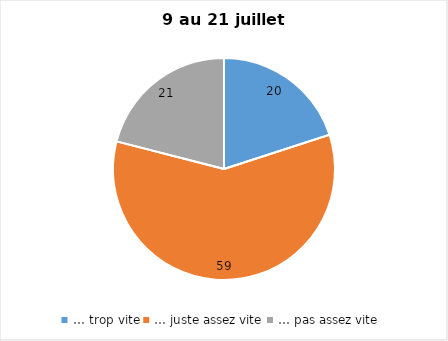
| Category | Series 0 |
|---|---|
| … trop vite | 20 |
| … juste assez vite | 59 |
| … pas assez vite | 21 |